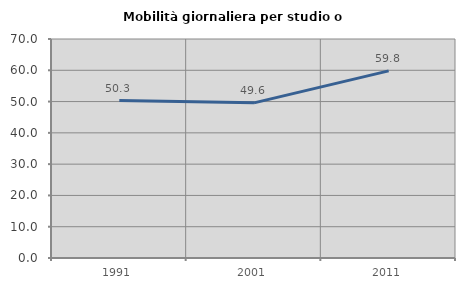
| Category | Mobilità giornaliera per studio o lavoro |
|---|---|
| 1991.0 | 50.313 |
| 2001.0 | 49.595 |
| 2011.0 | 59.806 |